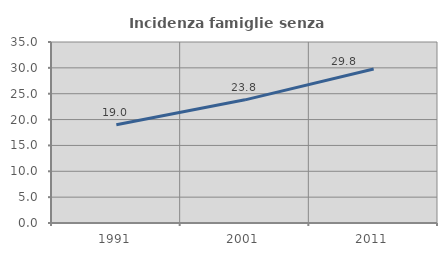
| Category | Incidenza famiglie senza nuclei |
|---|---|
| 1991.0 | 18.987 |
| 2001.0 | 23.815 |
| 2011.0 | 29.793 |